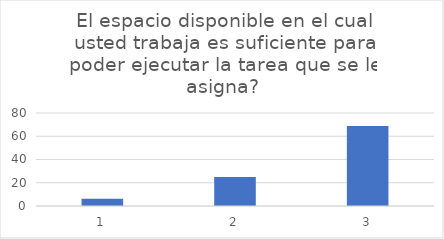
| Category | El espacio disponible en el cual usted trabaja es suficiente para poder ejecutar la tarea que se le asigna? |
|---|---|
| 0 | 6.25 |
| 1 | 25 |
| 2 | 68.75 |